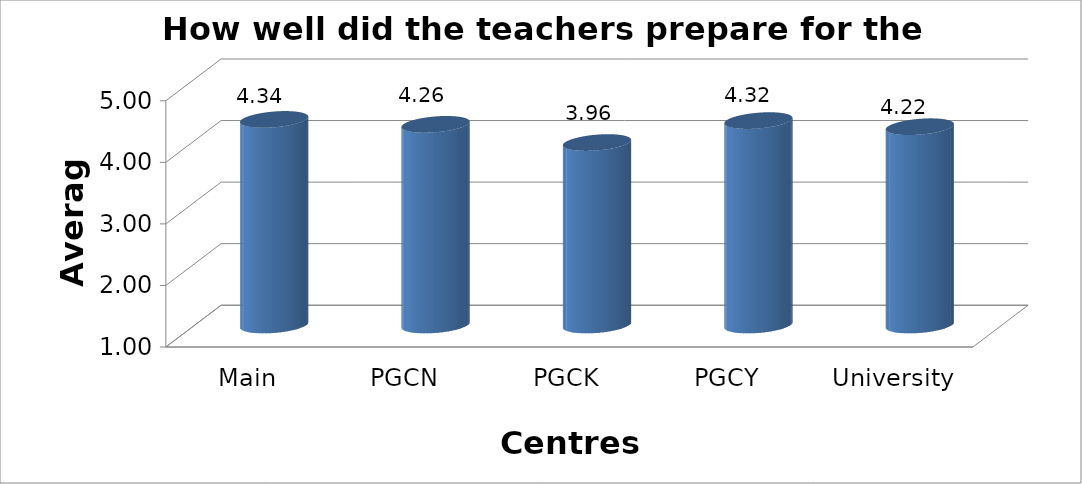
| Category | How well did the teachers prepare for the classes |
|---|---|
| Main Campus | 4.34 |
| PGCN | 4.26 |
| PGCK | 3.964 |
| PGCY | 4.321 |
| University Avg | 4.221 |